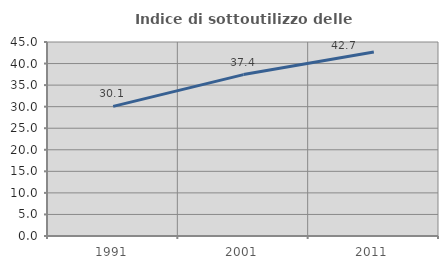
| Category | Indice di sottoutilizzo delle abitazioni  |
|---|---|
| 1991.0 | 30.058 |
| 2001.0 | 37.44 |
| 2011.0 | 42.671 |